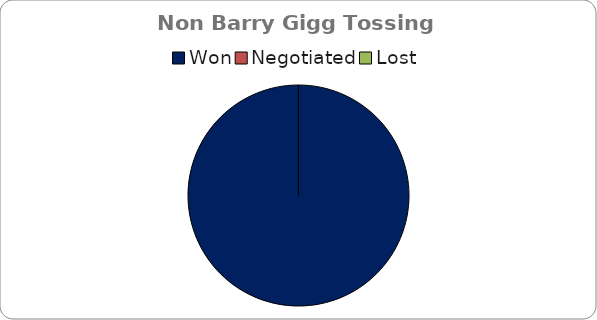
| Category | Non Barry Gigg |
|---|---|
| Won | 2 |
| Negotiated | 0 |
| Lost | 0 |